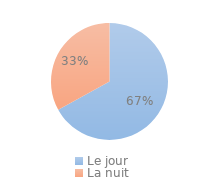
| Category | Series 0 |
|---|---|
| Le jour | 0.67 |
| La nuit | 0.33 |